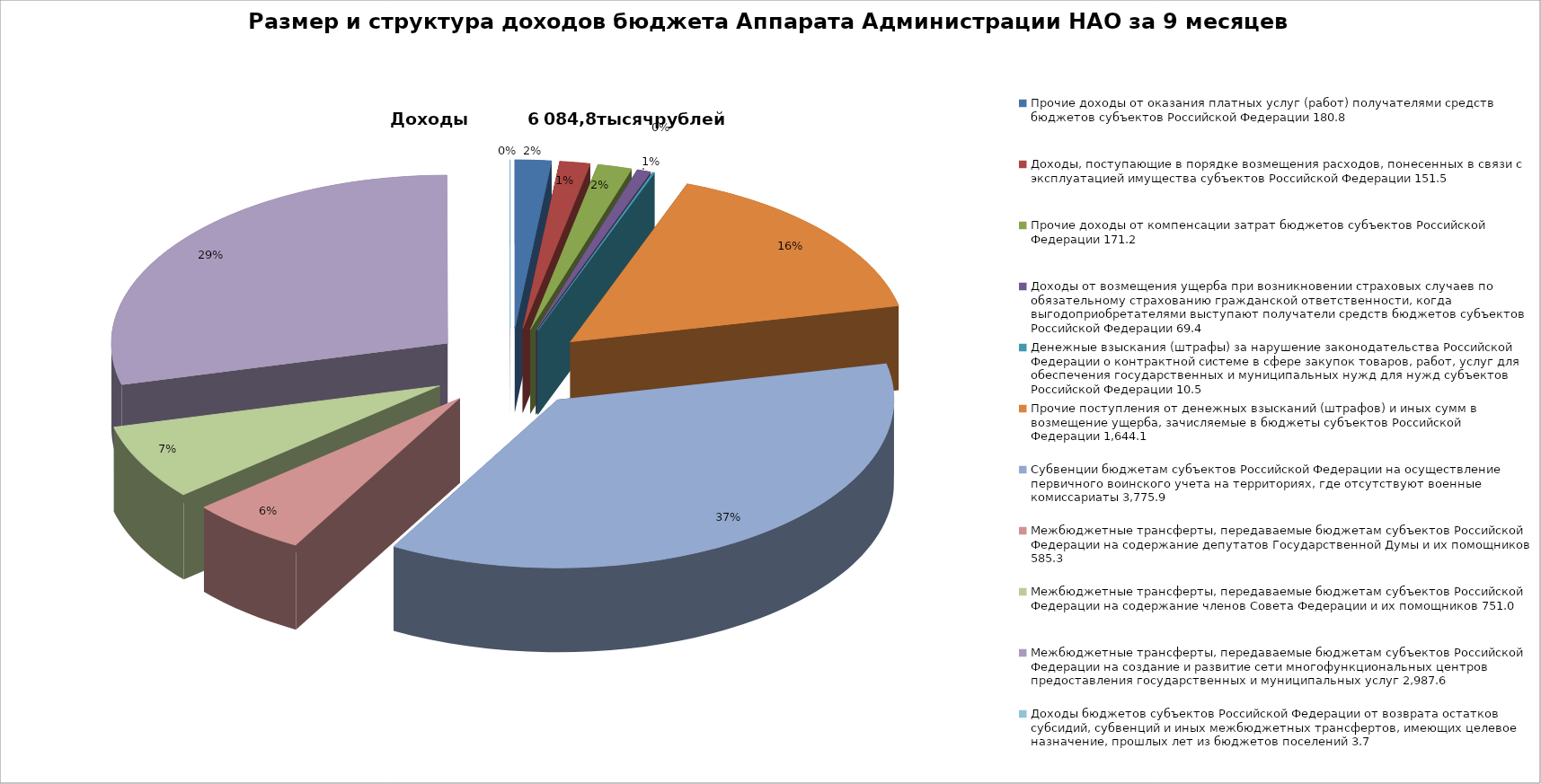
| Category | Размер и структура доходов бюджета Аппарата Администрации НАО за 12 месяцев 2015 года |
|---|---|
| 0 | 180.8 |
| 1 | 151.5 |
| 2 | 171.2 |
| 3 | 69.4 |
| 4 | 10.5 |
| 5 | 1644.1 |
| 6 | 3775.9 |
| 7 | 585.3 |
| 8 | 751 |
| 9 | 2987.6 |
| 10 | 3.7 |